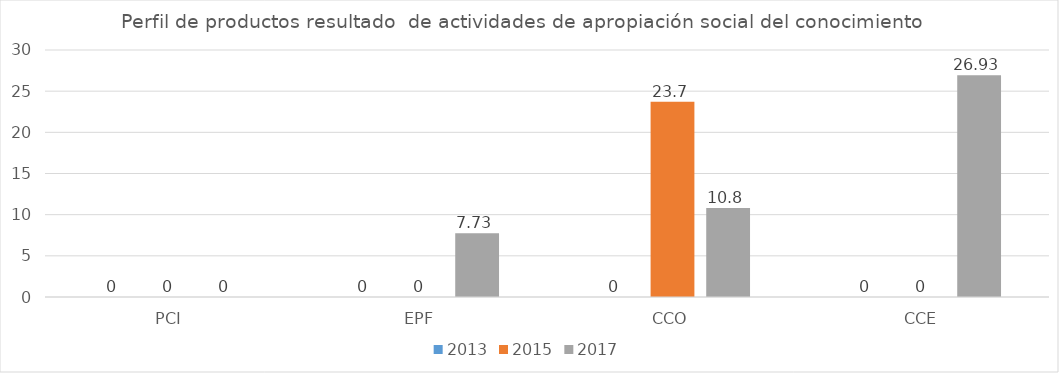
| Category | 2013 | 2015 | 2017 |
|---|---|---|---|
| PCI | 0 | 0 | 0 |
| EPF | 0 | 0 | 7.73 |
| CCO | 0 | 23.7 | 10.8 |
| CCE | 0 | 0 | 26.93 |